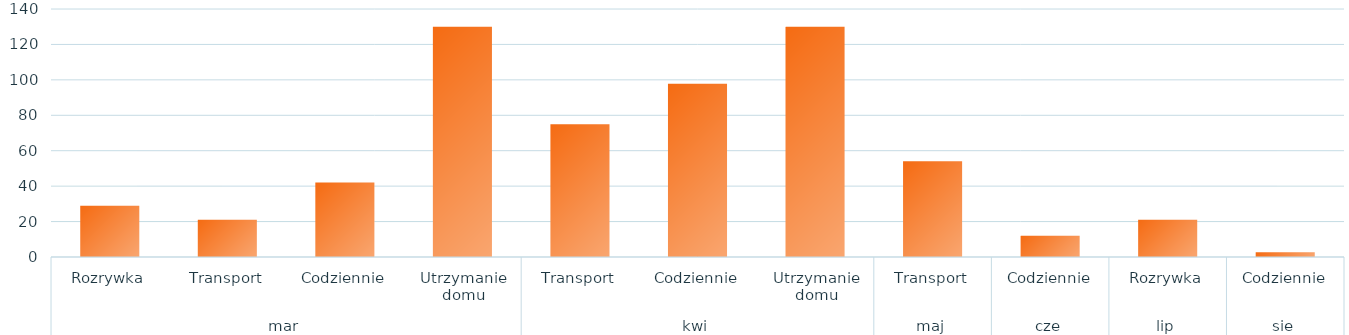
| Category | Suma |
|---|---|
| 0 | 29 |
| 1 | 21 |
| 2 | 42 |
| 3 | 130 |
| 4 | 75 |
| 5 | 97.75 |
| 6 | 130 |
| 7 | 54 |
| 8 | 12 |
| 9 | 21 |
| 10 | 2.75 |